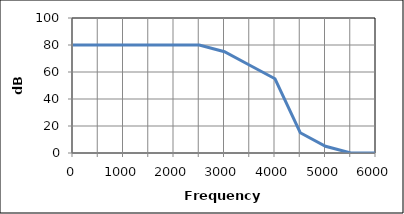
| Category | Series 0 |
|---|---|
| 0.0 | 80 |
| nan | 80 |
| 1000.0 | 80 |
| nan | 80 |
| 2000.0 | 80 |
| nan | 80 |
| 3000.0 | 75 |
| nan | 65 |
| 4000.0 | 55 |
| nan | 15 |
| 5000.0 | 5 |
| nan | 0 |
| 6000.0 | 0 |